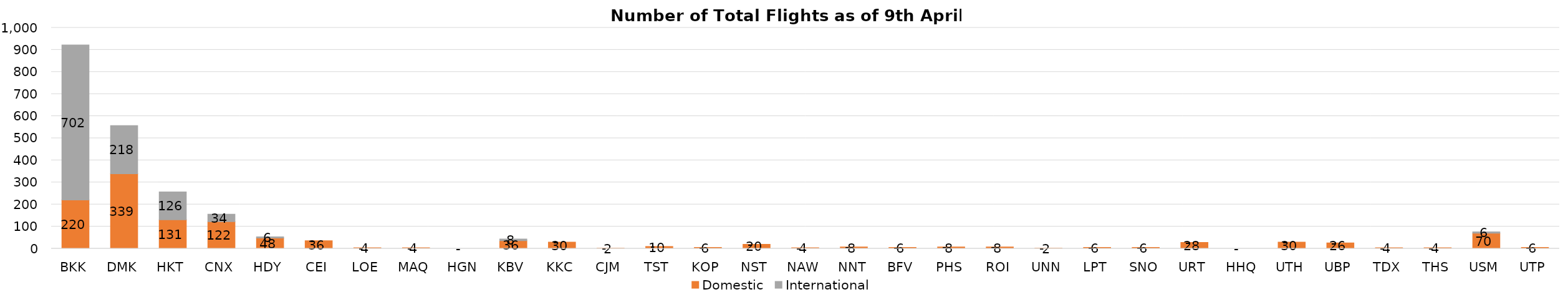
| Category | Domestic | International |
|---|---|---|
| BKK | 220 | 702 |
| DMK | 339 | 218 |
| HKT | 131 | 126 |
| CNX | 122 | 34 |
| HDY | 48 | 6 |
| CEI | 36 | 0 |
| LOE | 4 | 0 |
| MAQ | 4 | 0 |
| HGN | 0 | 0 |
| KBV | 36 | 8 |
| KKC | 30 | 0 |
| CJM | 2 | 0 |
| TST | 10 | 0 |
| KOP | 6 | 0 |
| NST | 20 | 0 |
| NAW | 4 | 0 |
| NNT | 8 | 0 |
| BFV | 6 | 0 |
| PHS | 8 | 0 |
| ROI | 8 | 0 |
| UNN | 2 | 0 |
| LPT | 6 | 0 |
| SNO | 6 | 0 |
| URT | 28 | 0 |
| HHQ | 0 | 0 |
| UTH | 30 | 0 |
| UBP | 26 | 0 |
| TDX | 4 | 0 |
| THS | 4 | 0 |
| USM | 70 | 6 |
| UTP | 6 | 0 |